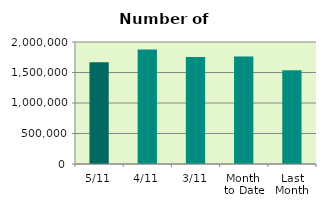
| Category | Series 0 |
|---|---|
| 5/11 | 1666248 |
| 4/11 | 1876378 |
| 3/11 | 1756064 |
| Month 
to Date | 1762729 |
| Last
Month | 1538680.909 |